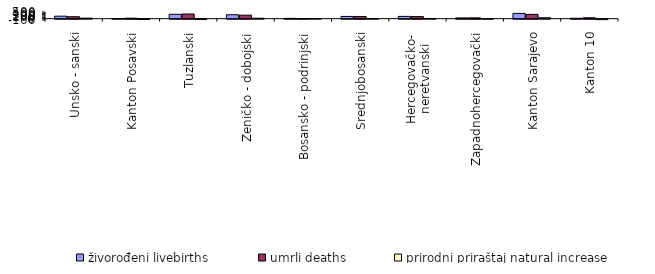
| Category | živorođeni livebirths | umrli deaths | prirodni priraštaj natural increase |
|---|---|---|---|
| Unsko - sanski | 187 | 146 | 41 |
| Kanton Posavski | 11 | 36 | -25 |
| Tuzlanski | 330 | 351 | -21 |
| Zeničko - dobojski | 296 | 262 | 34 |
| Bosansko - podrinjski | 23 | 10 | 13 |
| Srednjobosanski | 168 | 164 | 4 |
| Hercegovačko-
neretvanski | 171 | 156 | 15 |
| Zapadnohercegovački | 57 | 61 | -4 |
| Kanton Sarajevo | 393 | 322 | 71 |
| Kanton 10 | 31 | 67 | -36 |